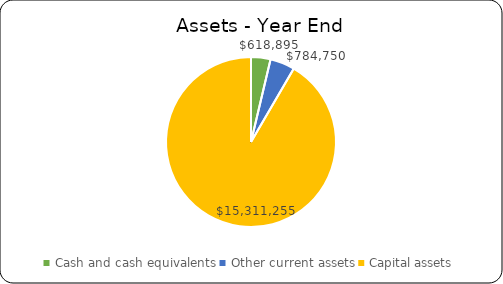
| Category | Series 0 |
|---|---|
| Cash and cash equivalents | 618895 |
| Other current assets | 784750 |
| Capital assets | 15311255 |